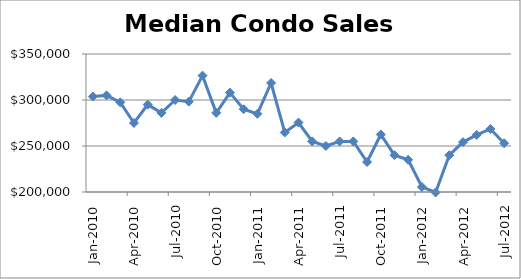
| Category | Series 0 |
|---|---|
| 2010-01-01 | 303750 |
| 2010-02-01 | 305000 |
| 2010-03-01 | 297500 |
| 2010-04-01 | 275000 |
| 2010-05-01 | 295000 |
| 2010-06-01 | 286000 |
| 2010-07-01 | 300000 |
| 2010-08-01 | 298225 |
| 2010-09-01 | 326500 |
| 2010-10-01 | 286000 |
| 2010-11-01 | 308000 |
| 2010-12-01 | 290000 |
| 2011-01-01 | 285000 |
| 2011-02-01 | 318500 |
| 2011-03-01 | 264750 |
| 2011-04-01 | 275500 |
| 2011-05-01 | 255000 |
| 2011-06-01 | 250000 |
| 2011-07-01 | 255000 |
| 2011-08-01 | 255000 |
| 2011-09-01 | 232600 |
| 2011-10-01 | 262500 |
| 2011-11-01 | 240000 |
| 2011-12-01 | 235000 |
| 2012-01-01 | 205500 |
| 2012-02-01 | 199500 |
| 2012-03-01 | 240000 |
| 2012-04-01 | 254250 |
| 2012-05-01 | 262000 |
| 2012-06-01 | 268500 |
| 2012-07-01 | 253000 |